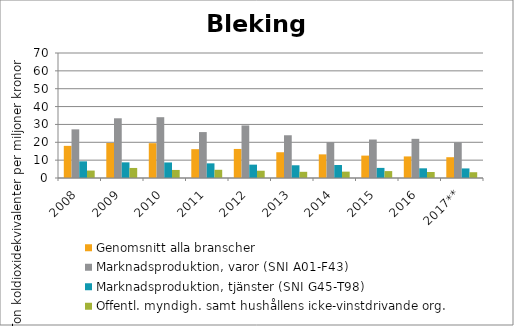
| Category | Genomsnitt alla branscher | Marknadsproduktion, varor (SNI A01-F43) | Marknadsproduktion, tjänster (SNI G45-T98) | Offentl. myndigh. samt hushållens icke-vinstdrivande org. |
|---|---|---|---|---|
| 2008 | 17.996 | 27.244 | 9.33 | 4.166 |
| 2009 | 19.62 | 33.44 | 8.769 | 5.623 |
| 2010 | 19.503 | 34.049 | 8.708 | 4.508 |
| 2011 | 16.142 | 25.719 | 8.205 | 4.599 |
| 2012 | 16.271 | 29.432 | 7.482 | 4.064 |
| 2013 | 14.422 | 23.937 | 7.124 | 3.47 |
| 2014 | 13.234 | 20.151 | 7.274 | 3.56 |
| 2015 | 12.544 | 21.546 | 5.657 | 3.867 |
| 2016 | 12.08 | 21.934 | 5.426 | 3.348 |
| 2017** | 11.637 | 19.987 | 5.363 | 3.236 |